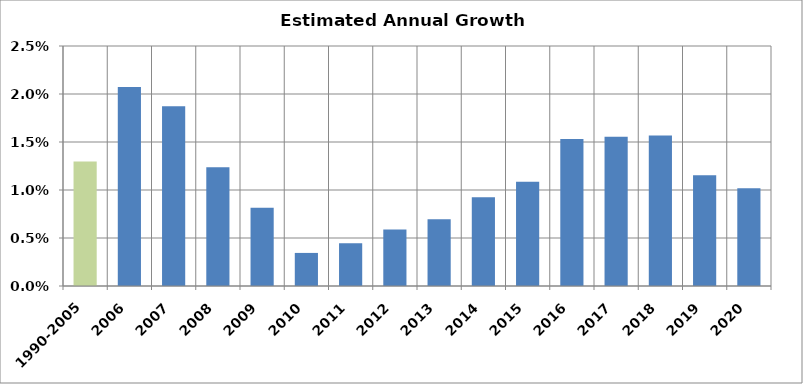
| Category | Annual Growth Estimates |
|---|---|
| 1990-2005 | 0.013 |
| 2006 | 0.021 |
| 2007 | 0.019 |
| 2008 | 0.012 |
| 2009 | 0.008 |
| 2010 | 0.003 |
| 2011 | 0.004 |
| 2012 | 0.006 |
| 2013 | 0.007 |
| 2014 | 0.009 |
| 2015 | 0.011 |
| 2016 | 0.015 |
| 2017 | 0.016 |
| 2018 | 0.016 |
| 2019 | 0.012 |
| 2020 | 0.01 |